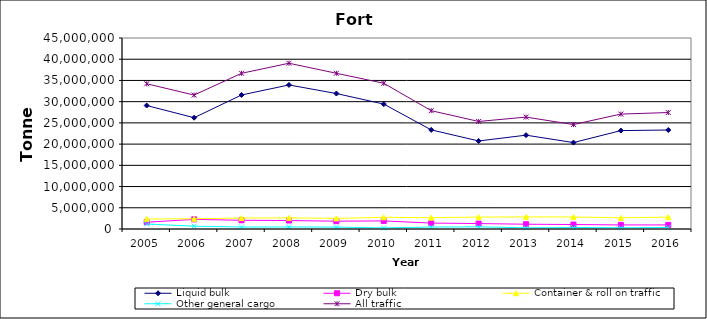
| Category | Liquid bulk | Dry bulk | Container & roll on traffic | Other general cargo | All traffic |
|---|---|---|---|---|---|
| 2005.0 | 29090000 | 1596000 | 2361000 | 1171000 | 34218000 |
| 2006.0 | 26220000 | 2264000 | 2407000 | 663000 | 31556000 |
| 2007.0 | 31578000 | 2051000 | 2582000 | 470000 | 36681000 |
| 2008.0 | 33941000 | 1994000 | 2627000 | 492000 | 39054000 |
| 2009.0 | 31913166 | 1840497 | 2494191 | 442331 | 36690185 |
| 2010.0 | 29432000 | 1904000 | 2751000 | 249000 | 34335000 |
| 2011.0 | 23353000 | 1392000 | 2666000 | 466000 | 27878000 |
| 2012.0 | 20739000 | 1283000 | 2798000 | 512000 | 25332000 |
| 2013.0 | 22109000 | 1125000 | 2858000 | 273000 | 26365000 |
| 2014.0 | 20363000 | 1056000 | 2834000 | 355000 | 24608000 |
| 2015.0 | 23183000 | 958000 | 2643000 | 290000 | 27074000 |
| 2016.0 | 23323000 | 963000 | 2792000 | 361000 | 27439000 |